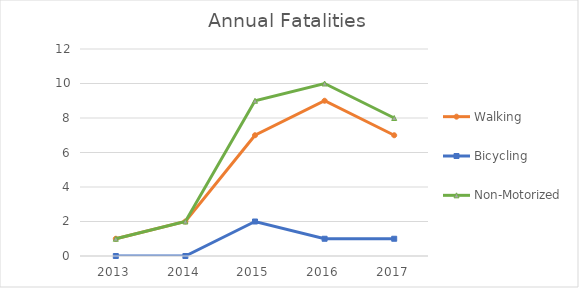
| Category | Walking | Bicycling | Non-Motorized |
|---|---|---|---|
| 2013 | 1 | 0 | 1 |
| 2014 | 2 | 0 | 2 |
| 2015 | 7 | 2 | 9 |
| 2016 | 9 | 1 | 10 |
| 2017 | 7 | 1 | 8 |